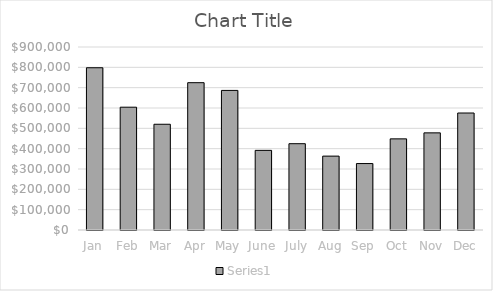
| Category | Series 0 |
|---|---|
| Jan | 797965.66 |
| Feb | 603969.8 |
| Mar | 520069.17 |
| Apr | 724520.51 |
| May | 686453.1 |
| June | 391622.25 |
| July | 424483.9 |
| Aug | 363350.343 |
| Sep | 326805.78 |
| Oct | 448218.96 |
| Nov | 477684.142 |
| Dec | 575374.638 |